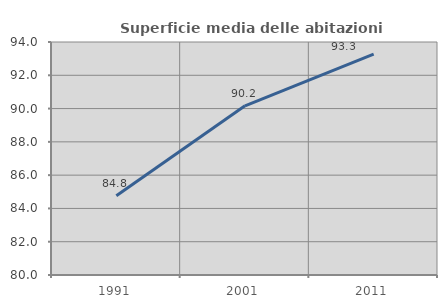
| Category | Superficie media delle abitazioni occupate |
|---|---|
| 1991.0 | 84.759 |
| 2001.0 | 90.168 |
| 2011.0 | 93.271 |